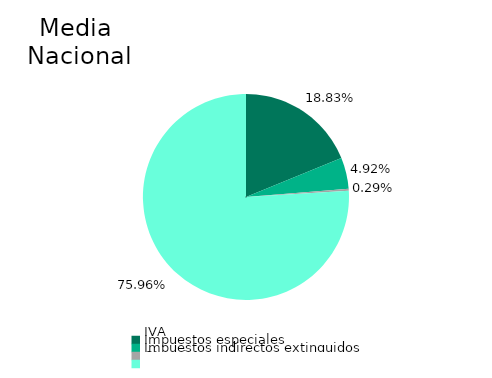
| Category | Media 
Nacional |
|---|---|
| IVA | 0.188 |
| Impuestos especiales | 0.049 |
| Impuestos indirectos extinguidos | 0.003 |
| Otros impuestos | 0.76 |